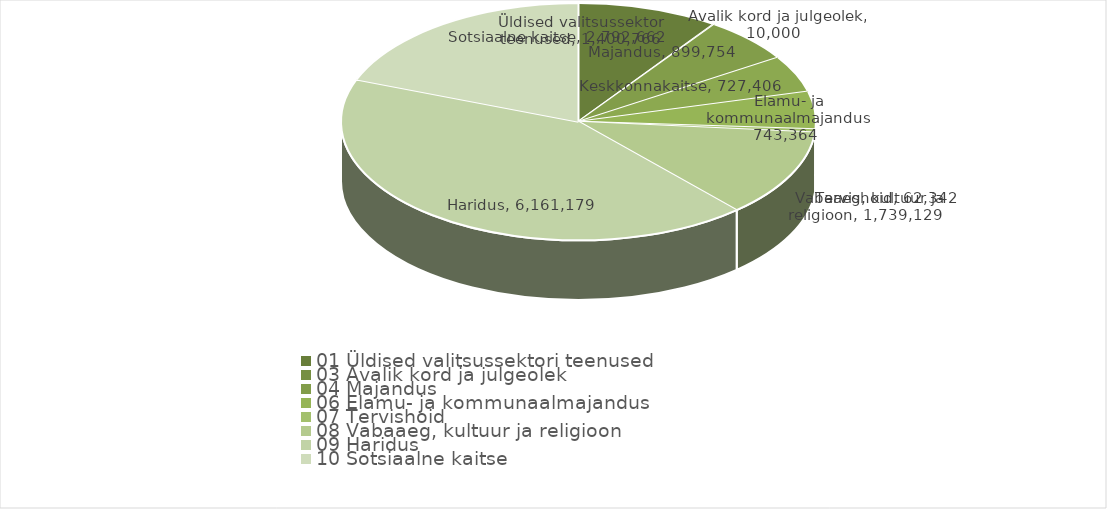
| Category | Series 0 |
|---|---|
| 0 | 1400766 |
| 1 | 10000 |
| 2 | 899754 |
| 3 | 727406 |
| 4 | 743364 |
| 5 | 62342 |
| 6 | 1739129 |
| 7 | 6161179 |
| 8 | 2792662 |